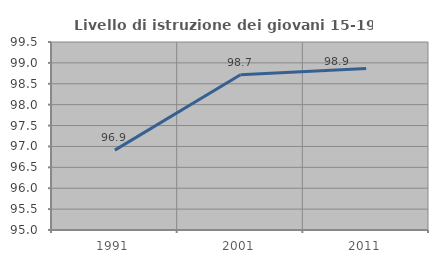
| Category | Livello di istruzione dei giovani 15-19 anni |
|---|---|
| 1991.0 | 96.911 |
| 2001.0 | 98.715 |
| 2011.0 | 98.864 |